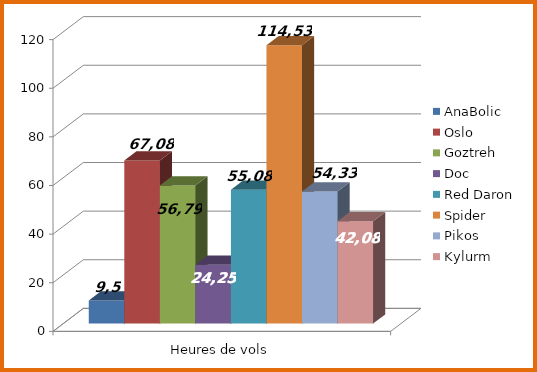
| Category | AnaBolic | Oslo | Goztreh | Doc | Red Daron | Spider | Pikos | Kylurm |
|---|---|---|---|---|---|---|---|---|
| 0 | 9.5 | 67.08 | 56.78 | 24.25 | 55.08 | 114.53 | 54.33 | 42.08 |